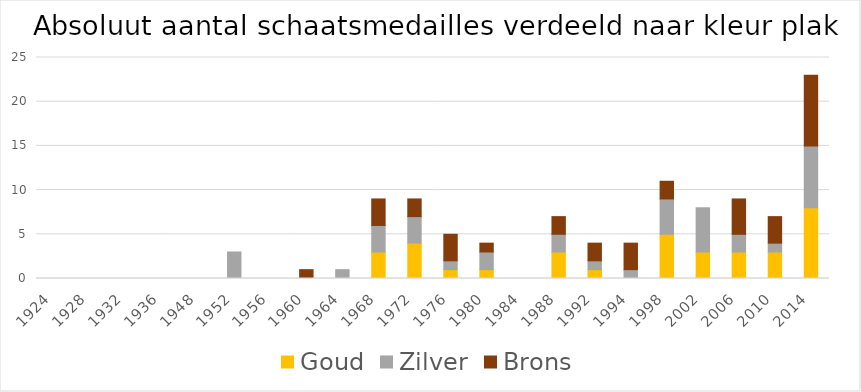
| Category | Goud | Zilver | Brons |
|---|---|---|---|
| 1924.0 | 0 | 0 | 0 |
| 1928.0 | 0 | 0 | 0 |
| 1932.0 | 0 | 0 | 0 |
| 1936.0 | 0 | 0 | 0 |
| 1948.0 | 0 | 0 | 0 |
| 1952.0 | 0 | 3 | 0 |
| 1956.0 | 0 | 0 | 0 |
| 1960.0 | 0 | 0 | 1 |
| 1964.0 | 0 | 1 | 0 |
| 1968.0 | 3 | 3 | 3 |
| 1972.0 | 4 | 3 | 2 |
| 1976.0 | 1 | 1 | 3 |
| 1980.0 | 1 | 2 | 1 |
| 1984.0 | 0 | 0 | 0 |
| 1988.0 | 3 | 2 | 2 |
| 1992.0 | 1 | 1 | 2 |
| 1994.0 | 0 | 1 | 3 |
| 1998.0 | 5 | 4 | 2 |
| 2002.0 | 3 | 5 | 0 |
| 2006.0 | 3 | 2 | 4 |
| 2010.0 | 3 | 1 | 3 |
| 2014.0 | 8 | 7 | 8 |